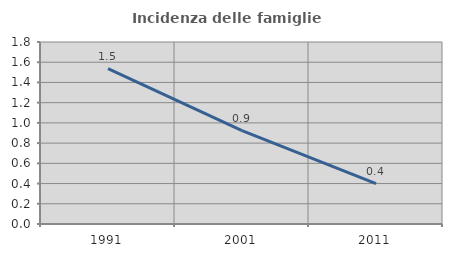
| Category | Incidenza delle famiglie numerose |
|---|---|
| 1991.0 | 1.537 |
| 2001.0 | 0.924 |
| 2011.0 | 0.399 |